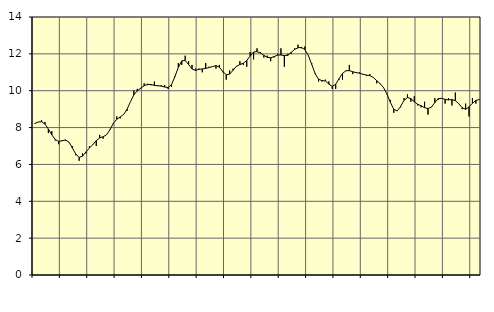
| Category | Piggar | Series 1 |
|---|---|---|
| nan | 8.2 | 8.22 |
| 87.0 | 8.3 | 8.3 |
| 87.0 | 8.4 | 8.32 |
| 87.0 | 8.3 | 8.19 |
| nan | 7.7 | 7.92 |
| 88.0 | 7.8 | 7.61 |
| 88.0 | 7.3 | 7.35 |
| 88.0 | 7.1 | 7.25 |
| nan | 7.3 | 7.28 |
| 89.0 | 7.3 | 7.33 |
| 89.0 | 7.2 | 7.21 |
| 89.0 | 7 | 6.9 |
| nan | 6.5 | 6.56 |
| 90.0 | 6.2 | 6.38 |
| 90.0 | 6.6 | 6.45 |
| 90.0 | 6.6 | 6.68 |
| nan | 7 | 6.89 |
| 91.0 | 7.1 | 7.08 |
| 91.0 | 7 | 7.29 |
| 91.0 | 7.6 | 7.44 |
| nan | 7.4 | 7.5 |
| 92.0 | 7.6 | 7.61 |
| 92.0 | 7.9 | 7.88 |
| 92.0 | 8.2 | 8.23 |
| nan | 8.6 | 8.45 |
| 93.0 | 8.5 | 8.58 |
| 93.0 | 8.7 | 8.71 |
| 93.0 | 8.9 | 8.99 |
| nan | 9.4 | 9.4 |
| 94.0 | 10 | 9.78 |
| 94.0 | 10.1 | 9.99 |
| 94.0 | 10.1 | 10.14 |
| nan | 10.4 | 10.27 |
| 95.0 | 10.3 | 10.35 |
| 95.0 | 10.3 | 10.33 |
| 95.0 | 10.5 | 10.29 |
| nan | 10.3 | 10.27 |
| 96.0 | 10.3 | 10.25 |
| 96.0 | 10.3 | 10.2 |
| 96.0 | 10.1 | 10.17 |
| nan | 10.2 | 10.33 |
| 97.0 | 10.8 | 10.77 |
| 97.0 | 11.5 | 11.27 |
| 97.0 | 11.4 | 11.62 |
| nan | 11.9 | 11.64 |
| 98.0 | 11.6 | 11.42 |
| 98.0 | 11.4 | 11.18 |
| 98.0 | 11.2 | 11.1 |
| nan | 11.2 | 11.16 |
| 99.0 | 11 | 11.18 |
| 99.0 | 11.5 | 11.21 |
| 99.0 | 11.3 | 11.26 |
| nan | 11.3 | 11.31 |
| 0.0 | 11.2 | 11.36 |
| 0.0 | 11.4 | 11.28 |
| 0.0 | 11 | 11.04 |
| nan | 10.6 | 10.87 |
| 1.0 | 11.1 | 10.9 |
| 1.0 | 11.2 | 11.11 |
| 1.0 | 11.3 | 11.33 |
| nan | 11.6 | 11.42 |
| 2.0 | 11.4 | 11.49 |
| 2.0 | 11.3 | 11.64 |
| 2.0 | 12.1 | 11.88 |
| nan | 11.7 | 12.1 |
| 3.0 | 12.3 | 12.12 |
| 3.0 | 12.1 | 12.05 |
| 3.0 | 11.8 | 11.92 |
| nan | 11.9 | 11.81 |
| 4.0 | 11.6 | 11.79 |
| 4.0 | 11.8 | 11.85 |
| 4.0 | 12 | 11.93 |
| nan | 12.3 | 11.94 |
| 5.0 | 11.3 | 11.9 |
| 5.0 | 12 | 11.92 |
| 5.0 | 12 | 12.08 |
| nan | 12.3 | 12.24 |
| 6.0 | 12.5 | 12.33 |
| 6.0 | 12.3 | 12.35 |
| 6.0 | 12.4 | 12.23 |
| nan | 11.9 | 11.92 |
| 7.0 | 11.5 | 11.43 |
| 7.0 | 10.9 | 10.93 |
| 7.0 | 10.5 | 10.62 |
| nan | 10.5 | 10.55 |
| 8.0 | 10.6 | 10.53 |
| 8.0 | 10.5 | 10.36 |
| 8.0 | 10.1 | 10.24 |
| nan | 10.1 | 10.35 |
| 9.0 | 10.6 | 10.65 |
| 9.0 | 10.6 | 10.94 |
| 9.0 | 11.1 | 11.08 |
| nan | 11.4 | 11.09 |
| 10.0 | 10.9 | 11.03 |
| 10.0 | 11 | 10.98 |
| 10.0 | 11 | 10.95 |
| nan | 10.9 | 10.89 |
| 11.0 | 10.8 | 10.85 |
| 11.0 | 10.9 | 10.82 |
| 11.0 | 10.7 | 10.72 |
| nan | 10.4 | 10.55 |
| 12.0 | 10.4 | 10.38 |
| 12.0 | 10.2 | 10.17 |
| 12.0 | 9.8 | 9.82 |
| nan | 9.5 | 9.37 |
| 13.0 | 8.8 | 8.99 |
| 13.0 | 8.9 | 8.9 |
| 13.0 | 9.1 | 9.15 |
| nan | 9.6 | 9.48 |
| 14.0 | 9.8 | 9.63 |
| 14.0 | 9.4 | 9.57 |
| 14.0 | 9.7 | 9.4 |
| nan | 9.2 | 9.26 |
| 15.0 | 9.1 | 9.18 |
| 15.0 | 9.4 | 9.08 |
| 15.0 | 8.7 | 9.03 |
| nan | 9.1 | 9.11 |
| 16.0 | 9.6 | 9.36 |
| 16.0 | 9.5 | 9.57 |
| 16.0 | 9.6 | 9.59 |
| nan | 9.3 | 9.53 |
| 17.0 | 9.6 | 9.5 |
| 17.0 | 9.2 | 9.52 |
| 17.0 | 9.9 | 9.46 |
| nan | 9.3 | 9.29 |
| 18.0 | 9 | 9.08 |
| 18.0 | 9.3 | 8.99 |
| 18.0 | 8.6 | 9.12 |
| nan | 9.6 | 9.32 |
| 19.0 | 9.3 | 9.47 |
| 19.0 | 9.5 | 9.52 |